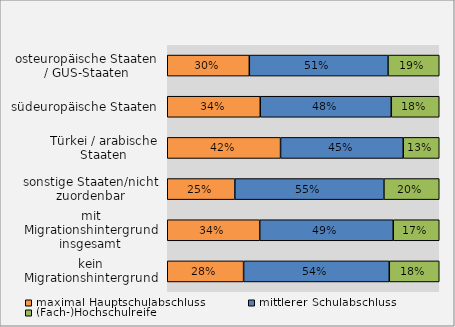
| Category | maximal Hauptschulabschluss | mittlerer Schulabschluss | (Fach-)Hochschulreife |
|---|---|---|---|
| kein Migrationshintergrund | 0.281 | 0.536 | 0.184 |
| mit Migrationshintergrund insgesamt | 0.34 | 0.491 | 0.169 |
| sonstige Staaten/nicht zuordenbar | 0.248 | 0.548 | 0.203 |
| Türkei / arabische Staaten | 0.417 | 0.451 | 0.132 |
| südeuropäische Staaten | 0.342 | 0.482 | 0.176 |
| osteuropäische Staaten / GUS-Staaten | 0.302 | 0.51 | 0.188 |